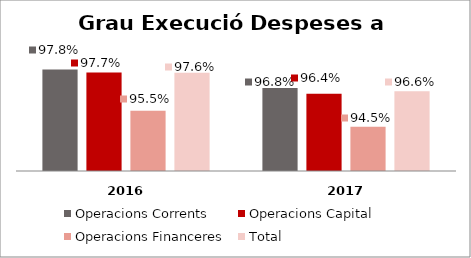
| Category | Operacions Corrents | Operacions Capital | Operacions Financeres | Total |
|---|---|---|---|---|
| 0 | 0.978 | 0.977 | 0.955 | 0.976 |
| 1 | 0.968 | 0.964 | 0.945 | 0.966 |